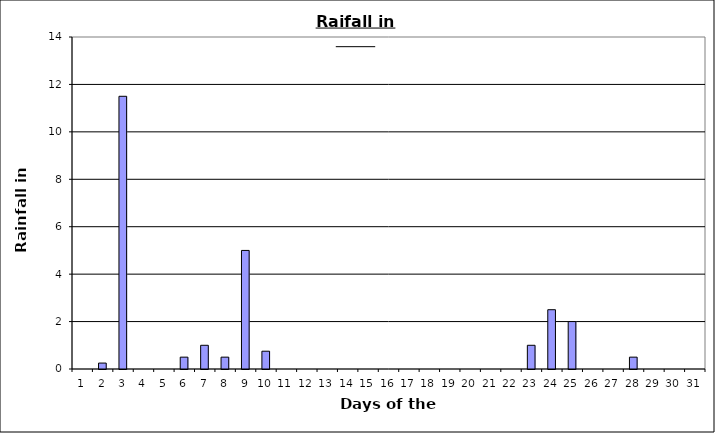
| Category | Series 0 |
|---|---|
| 0 | 0 |
| 1 | 0.25 |
| 2 | 11.5 |
| 3 | 0 |
| 4 | 0 |
| 5 | 0.5 |
| 6 | 1 |
| 7 | 0.5 |
| 8 | 5 |
| 9 | 0.75 |
| 10 | 0 |
| 11 | 0 |
| 12 | 0 |
| 13 | 0 |
| 14 | 0 |
| 15 | 0 |
| 16 | 0 |
| 17 | 0 |
| 18 | 0 |
| 19 | 0 |
| 20 | 0 |
| 21 | 0 |
| 22 | 1 |
| 23 | 2.5 |
| 24 | 2 |
| 25 | 0 |
| 26 | 0 |
| 27 | 0.5 |
| 28 | 0 |
| 29 | 0 |
| 30 | 0 |